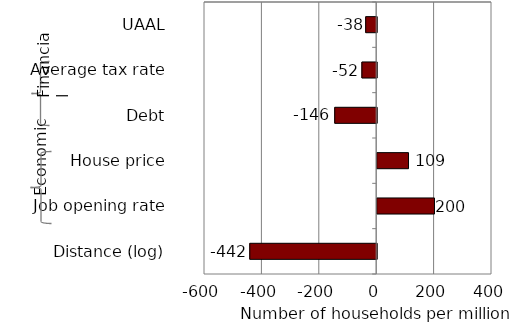
| Category | Series 0 |
|---|---|
| UAAL | -38.293 |
| Average tax rate | -51.587 |
| Debt | -146.198 |
| House price | 109.167 |
| Job opening rate | 199.546 |
| Distance (log) | -442.218 |